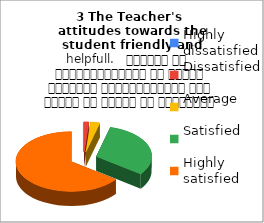
| Category | 3 The Teacher's 
attitudes towards the student friendly and helpfull.   शिक्षक का विद्यार्थियों के प्रति व्यवहार मित्रतापूर्ण एवम सहयोग के भावना से परिपूर्ण था |
|---|---|
| Highly dissatisfied | 0 |
| Dissatisfied | 1 |
| Average | 2 |
| Satisfied | 23 |
| Highly satisfied | 48 |